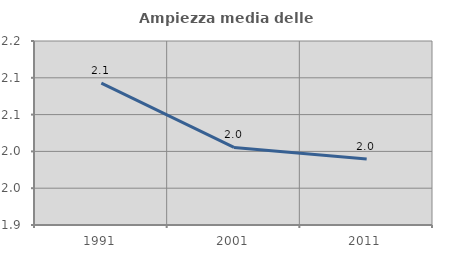
| Category | Ampiezza media delle famiglie |
|---|---|
| 1991.0 | 2.093 |
| 2001.0 | 2.005 |
| 2011.0 | 1.99 |